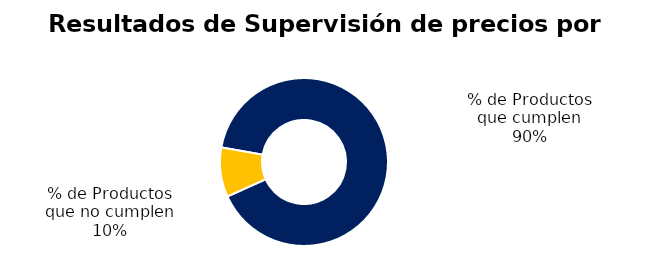
| Category | Series 0 |
|---|---|
| % de Productos que cumplen | 238 |
| % de Productos que no cumplen | 25 |